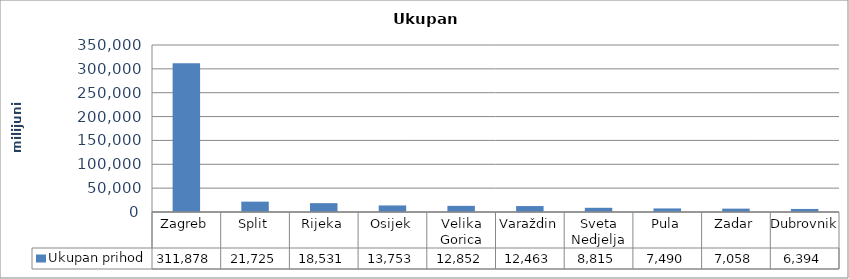
| Category | Ukupan prihod |
|---|---|
| Zagreb | 311878.344 |
| Split | 21724.674 |
| Rijeka | 18531.414 |
| Osijek | 13752.729 |
| Velika Gorica | 12851.949 |
| Varaždin | 12462.903 |
| Sveta Nedjelja | 8815.312 |
| Pula | 7489.876 |
| Zadar | 7058.325 |
| Dubrovnik | 6393.87 |